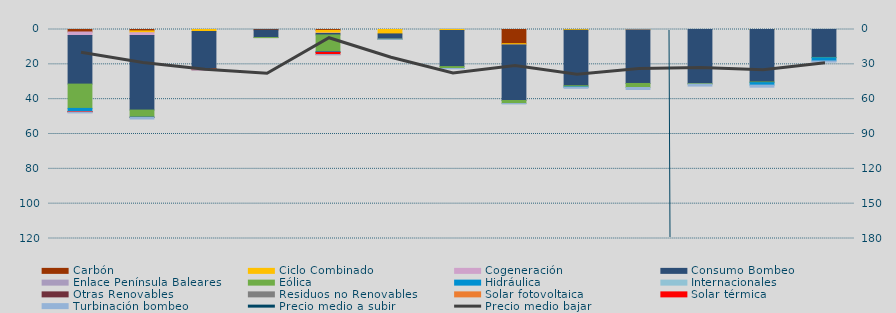
| Category | Carbón | Ciclo Combinado | Cogeneración | Consumo Bombeo | Enlace Península Baleares | Eólica | Hidráulica | Internacionales | Otras Renovables | Residuos no Renovables | Solar fotovoltaica | Solar térmica | Turbinación bombeo |
|---|---|---|---|---|---|---|---|---|---|---|---|---|---|
| 0 | 1420.9 | 0 | 2008.3 | 27920 | 0 | 13960.1 | 1762.8 |  | 22.7 | 98.3 | 0 | 224.2 | 474.7 |
| 1 | 808.2 | 1016.6 | 1618.6 | 42815.3 | 0 | 4070.8 | 105.9 |  | 51.2 | 12.8 | 0 | 0 | 879 |
| 2 | 0 | 1097.9 | 0 | 21404.4 | 0 | 137.4 | 0 |  | 0 | 0 | 0 | 518.8 | 108.8 |
| 3 | 294.2 | 0 | 0 | 4310.8 | 42.4 | 0.6 | 0 |  | 0 | 0 | 0 | 0 | 0 |
| 4 | 516.7 | 1537.9 | 257 | 809.6 | 0 | 9502.9 | 408.7 |  | 117.5 | 0 | 0.4 | 1254.7 | 102.9 |
| 5 | 0 | 2533.1 | 0 | 2991.4 | 0 | 42.6 | 0 |  | 0 | 0 | 0 | 0 | 65 |
| 6 | 0 | 555.8 | 0 | 20748.5 | 0 | 1071 | 8.2 |  | 0 | 0 | 0 | 0 | 183.2 |
| 7 | 8149.5 | 754.8 | 3.5 | 31856.3 | 0 | 1760.6 | 0 |  | 0 | 0 | 0 | 0 | 177.8 |
| 8 | 0 | 458.3 | 0 | 31829.7 | 0 | 671.7 | 189.5 |  | 0 | 0 | 0 | 0 | 613.5 |
| 9 | 0 | 223.8 | 2.4 | 30752.2 | 0 | 2324.3 | 0 |  | 0 | 0 | 0 | 0 | 1135.9 |
| 10 | 0 | 0 | 0 | 31097.5 | 0 | 268.5 | 0 |  | 0 | 0 | 0 | 0 | 1121.8 |
| 11 | 0 | 20 | 0 | 30123.6 | 0 | 373.8 | 1416.6 |  | 0 | 0 | 0 | 0 | 1190.9 |
| 12 | 0 | 0 | 0 | 16053.6 | 0 | 185.3 | 1837.6 |  | 0 | 0 | 0 | 0 | 606.6 |